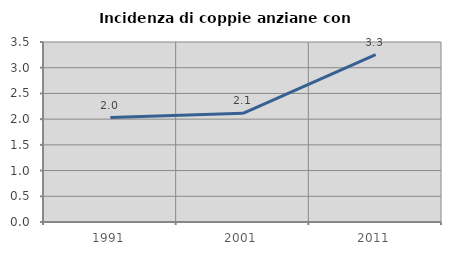
| Category | Incidenza di coppie anziane con figli |
|---|---|
| 1991.0 | 2.03 |
| 2001.0 | 2.113 |
| 2011.0 | 3.254 |